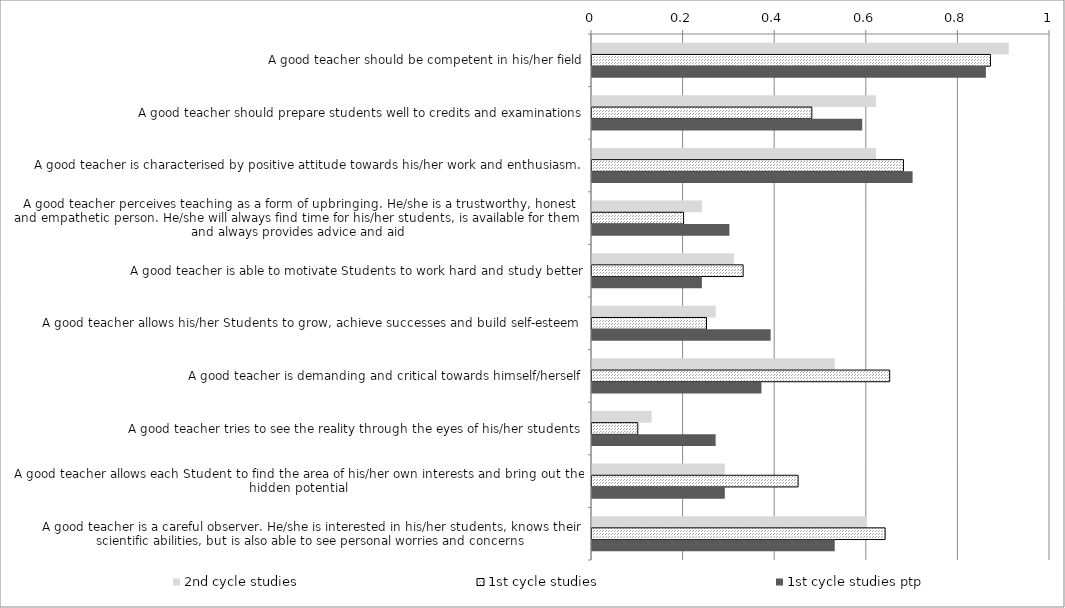
| Category | 2nd cycle studies | 1st cycle studies | 1st cycle studies ptp |
|---|---|---|---|
| A good teacher should be competent in his/her field | 0.91 | 0.87 | 0.86 |
| A good teacher should prepare students well to credits and examinations | 0.62 | 0.48 | 0.59 |
| A good teacher is characterised by positive attitude towards his/her work and enthusiasm. | 0.62 | 0.68 | 0.7 |
| A good teacher perceives teaching as a form of upbringing. He/she is a trustworthy, honest and empathetic person. He/she will always find time for his/her students, is available for them and always provides advice and aid | 0.24 | 0.2 | 0.3 |
| A good teacher is able to motivate Students to work hard and study better | 0.31 | 0.33 | 0.24 |
| A good teacher allows his/her Students to grow, achieve successes and build self-esteem | 0.27 | 0.25 | 0.39 |
| A good teacher is demanding and critical towards himself/herself | 0.53 | 0.65 | 0.37 |
| A good teacher tries to see the reality through the eyes of his/her students | 0.13 | 0.1 | 0.27 |
| A good teacher allows each Student to find the area of his/her own interests and bring out the hidden potential | 0.29 | 0.45 | 0.29 |
| A good teacher is a careful observer. He/she is interested in his/her students, knows their scientific abilities, but is also able to see personal worries and concerns | 0.6 | 0.64 | 0.53 |